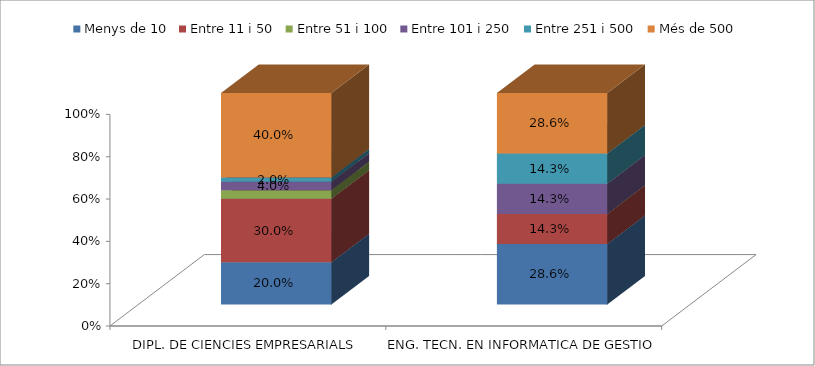
| Category | Menys de 10 | Entre 11 i 50 | Entre 51 i 100 | Entre 101 i 250 | Entre 251 i 500 | Més de 500 |
|---|---|---|---|---|---|---|
| DIPL. DE CIENCIES EMPRESARIALS | 0.2 | 0.3 | 0.04 | 0.04 | 0.02 | 0.4 |
| ENG. TECN. EN INFORMATICA DE GESTIO | 0.286 | 0.143 | 0 | 0.143 | 0.143 | 0.286 |